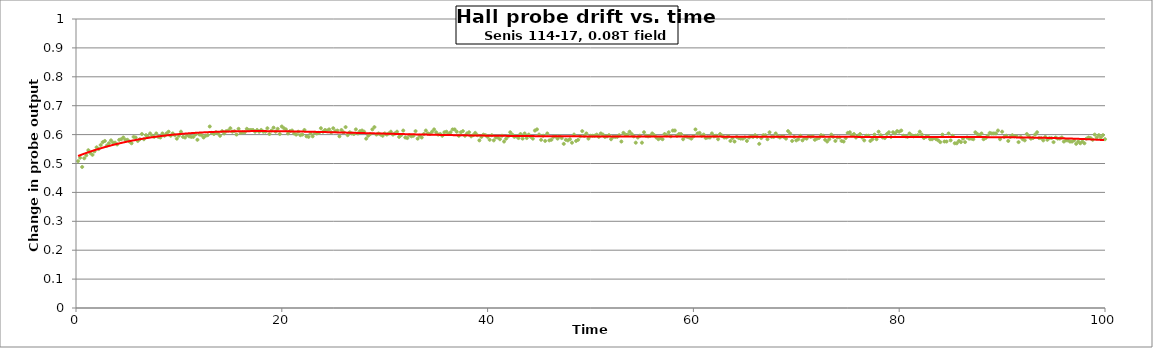
| Category | Probe |
|---|---|
| 0.2 | 0.508 |
| 0.4 | 0.52 |
| 0.6000000000000001 | 0.488 |
| 0.8 | 0.518 |
| 1.0 | 0.528 |
| 1.2 | 0.546 |
| 1.4 | 0.536 |
| 1.5999999999999999 | 0.53 |
| 1.7999999999999998 | 0.542 |
| 1.9999999999999998 | 0.556 |
| 2.1999999999999997 | 0.55 |
| 2.4 | 0.564 |
| 2.6 | 0.574 |
| 2.8000000000000003 | 0.578 |
| 3.0000000000000004 | 0.562 |
| 3.2000000000000006 | 0.57 |
| 3.400000000000001 | 0.58 |
| 3.600000000000001 | 0.572 |
| 3.800000000000001 | 0.572 |
| 4.000000000000001 | 0.566 |
| 4.200000000000001 | 0.582 |
| 4.400000000000001 | 0.584 |
| 4.600000000000001 | 0.59 |
| 4.800000000000002 | 0.582 |
| 5.000000000000002 | 0.582 |
| 5.200000000000002 | 0.576 |
| 5.400000000000002 | 0.57 |
| 5.600000000000002 | 0.592 |
| 5.8000000000000025 | 0.59 |
| 6.000000000000003 | 0.578 |
| 6.200000000000003 | 0.584 |
| 6.400000000000003 | 0.602 |
| 6.600000000000003 | 0.584 |
| 6.800000000000003 | 0.598 |
| 7.0000000000000036 | 0.592 |
| 7.200000000000004 | 0.604 |
| 7.400000000000004 | 0.596 |
| 7.600000000000004 | 0.592 |
| 7.800000000000004 | 0.604 |
| 8.000000000000004 | 0.592 |
| 8.200000000000003 | 0.59 |
| 8.400000000000002 | 0.604 |
| 8.600000000000001 | 0.596 |
| 8.8 | 0.604 |
| 9.0 | 0.61 |
| 9.2 | 0.596 |
| 9.399999999999999 | 0.604 |
| 9.599999999999998 | 0.598 |
| 9.799999999999997 | 0.586 |
| 9.999999999999996 | 0.596 |
| 10.199999999999996 | 0.61 |
| 10.399999999999995 | 0.592 |
| 10.599999999999994 | 0.59 |
| 10.799999999999994 | 0.598 |
| 10.999999999999993 | 0.594 |
| 11.199999999999992 | 0.592 |
| 11.399999999999991 | 0.592 |
| 11.59999999999999 | 0.6 |
| 11.79999999999999 | 0.582 |
| 11.99999999999999 | 0.6 |
| 12.199999999999989 | 0.598 |
| 12.399999999999988 | 0.59 |
| 12.599999999999987 | 0.596 |
| 12.799999999999986 | 0.598 |
| 12.999999999999986 | 0.628 |
| 13.199999999999985 | 0.606 |
| 13.399999999999984 | 0.602 |
| 13.599999999999984 | 0.608 |
| 13.799999999999983 | 0.604 |
| 13.999999999999982 | 0.596 |
| 14.199999999999982 | 0.612 |
| 14.39999999999998 | 0.604 |
| 14.59999999999998 | 0.612 |
| 14.79999999999998 | 0.614 |
| 14.999999999999979 | 0.622 |
| 15.199999999999978 | 0.61 |
| 15.399999999999977 | 0.612 |
| 15.599999999999977 | 0.6 |
| 15.799999999999976 | 0.62 |
| 15.999999999999975 | 0.606 |
| 16.199999999999974 | 0.608 |
| 16.399999999999974 | 0.608 |
| 16.599999999999973 | 0.62 |
| 16.799999999999972 | 0.616 |
| 16.99999999999997 | 0.616 |
| 17.19999999999997 | 0.616 |
| 17.39999999999997 | 0.61 |
| 17.59999999999997 | 0.616 |
| 17.79999999999997 | 0.61 |
| 17.999999999999968 | 0.616 |
| 18.199999999999967 | 0.61 |
| 18.399999999999967 | 0.61 |
| 18.599999999999966 | 0.622 |
| 18.799999999999965 | 0.602 |
| 18.999999999999964 | 0.614 |
| 19.199999999999964 | 0.624 |
| 19.399999999999963 | 0.61 |
| 19.599999999999962 | 0.62 |
| 19.79999999999996 | 0.602 |
| 19.99999999999996 | 0.628 |
| 20.19999999999996 | 0.622 |
| 20.39999999999996 | 0.618 |
| 20.59999999999996 | 0.604 |
| 20.799999999999958 | 0.612 |
| 20.999999999999957 | 0.614 |
| 21.199999999999957 | 0.604 |
| 21.399999999999956 | 0.6 |
| 21.599999999999955 | 0.61 |
| 21.799999999999955 | 0.598 |
| 21.999999999999954 | 0.6 |
| 22.199999999999953 | 0.616 |
| 22.399999999999952 | 0.594 |
| 22.59999999999995 | 0.592 |
| 22.79999999999995 | 0.604 |
| 22.99999999999995 | 0.594 |
| 23.19999999999995 | 0.606 |
| 23.39999999999995 | 0.604 |
| 23.599999999999948 | 0.606 |
| 23.799999999999947 | 0.622 |
| 23.999999999999947 | 0.61 |
| 24.199999999999946 | 0.616 |
| 24.399999999999945 | 0.614 |
| 24.599999999999945 | 0.618 |
| 24.799999999999944 | 0.608 |
| 24.999999999999943 | 0.622 |
| 25.199999999999942 | 0.612 |
| 25.39999999999994 | 0.614 |
| 25.59999999999994 | 0.594 |
| 25.79999999999994 | 0.616 |
| 25.99999999999994 | 0.608 |
| 26.19999999999994 | 0.626 |
| 26.399999999999938 | 0.598 |
| 26.599999999999937 | 0.608 |
| 26.799999999999937 | 0.604 |
| 26.999999999999936 | 0.602 |
| 27.199999999999935 | 0.618 |
| 27.399999999999935 | 0.604 |
| 27.599999999999934 | 0.612 |
| 27.799999999999933 | 0.614 |
| 27.999999999999932 | 0.61 |
| 28.199999999999932 | 0.586 |
| 28.39999999999993 | 0.596 |
| 28.59999999999993 | 0.602 |
| 28.79999999999993 | 0.618 |
| 28.99999999999993 | 0.626 |
| 29.19999999999993 | 0.6 |
| 29.399999999999928 | 0.604 |
| 29.599999999999927 | 0.6 |
| 29.799999999999926 | 0.596 |
| 29.999999999999925 | 0.604 |
| 30.199999999999925 | 0.6 |
| 30.399999999999924 | 0.604 |
| 30.599999999999923 | 0.61 |
| 30.799999999999923 | 0.6 |
| 30.999999999999922 | 0.604 |
| 31.19999999999992 | 0.61 |
| 31.39999999999992 | 0.592 |
| 31.59999999999992 | 0.598 |
| 31.79999999999992 | 0.614 |
| 31.99999999999992 | 0.59 |
| 32.19999999999992 | 0.588 |
| 32.39999999999992 | 0.598 |
| 32.59999999999992 | 0.594 |
| 32.799999999999926 | 0.596 |
| 32.99999999999993 | 0.612 |
| 33.19999999999993 | 0.586 |
| 33.399999999999935 | 0.596 |
| 33.59999999999994 | 0.59 |
| 33.79999999999994 | 0.602 |
| 33.99999999999994 | 0.614 |
| 34.199999999999946 | 0.604 |
| 34.39999999999995 | 0.602 |
| 34.59999999999995 | 0.61 |
| 34.799999999999955 | 0.618 |
| 34.99999999999996 | 0.608 |
| 35.19999999999996 | 0.6 |
| 35.39999999999996 | 0.602 |
| 35.599999999999966 | 0.596 |
| 35.79999999999997 | 0.608 |
| 35.99999999999997 | 0.61 |
| 36.199999999999974 | 0.602 |
| 36.39999999999998 | 0.608 |
| 36.59999999999998 | 0.618 |
| 36.79999999999998 | 0.618 |
| 36.999999999999986 | 0.61 |
| 37.19999999999999 | 0.596 |
| 37.39999999999999 | 0.608 |
| 37.599999999999994 | 0.612 |
| 37.8 | 0.596 |
| 38.0 | 0.604 |
| 38.2 | 0.608 |
| 38.400000000000006 | 0.594 |
| 38.60000000000001 | 0.598 |
| 38.80000000000001 | 0.606 |
| 39.000000000000014 | 0.598 |
| 39.20000000000002 | 0.58 |
| 39.40000000000002 | 0.592 |
| 39.60000000000002 | 0.6 |
| 39.800000000000026 | 0.598 |
| 40.00000000000003 | 0.592 |
| 40.20000000000003 | 0.582 |
| 40.400000000000034 | 0.598 |
| 40.60000000000004 | 0.58 |
| 40.80000000000004 | 0.59 |
| 41.00000000000004 | 0.59 |
| 41.200000000000045 | 0.584 |
| 41.40000000000005 | 0.596 |
| 41.60000000000005 | 0.576 |
| 41.800000000000054 | 0.586 |
| 42.00000000000006 | 0.594 |
| 42.20000000000006 | 0.608 |
| 42.40000000000006 | 0.6 |
| 42.600000000000065 | 0.592 |
| 42.80000000000007 | 0.594 |
| 43.00000000000007 | 0.588 |
| 43.200000000000074 | 0.602 |
| 43.40000000000008 | 0.586 |
| 43.60000000000008 | 0.604 |
| 43.80000000000008 | 0.588 |
| 44.000000000000085 | 0.6 |
| 44.20000000000009 | 0.592 |
| 44.40000000000009 | 0.586 |
| 44.600000000000094 | 0.614 |
| 44.8000000000001 | 0.618 |
| 45.0000000000001 | 0.6 |
| 45.2000000000001 | 0.582 |
| 45.400000000000105 | 0.596 |
| 45.60000000000011 | 0.578 |
| 45.80000000000011 | 0.604 |
| 46.000000000000114 | 0.58 |
| 46.20000000000012 | 0.582 |
| 46.40000000000012 | 0.592 |
| 46.60000000000012 | 0.594 |
| 46.800000000000125 | 0.586 |
| 47.00000000000013 | 0.594 |
| 47.20000000000013 | 0.588 |
| 47.400000000000134 | 0.568 |
| 47.600000000000136 | 0.582 |
| 47.80000000000014 | 0.58 |
| 48.00000000000014 | 0.584 |
| 48.200000000000145 | 0.572 |
| 48.40000000000015 | 0.6 |
| 48.60000000000015 | 0.578 |
| 48.80000000000015 | 0.582 |
| 49.000000000000156 | 0.594 |
| 49.20000000000016 | 0.612 |
| 49.40000000000016 | 0.596 |
| 49.600000000000165 | 0.604 |
| 49.80000000000017 | 0.586 |
| 50.00000000000017 | 0.596 |
| 50.20000000000017 | 0.596 |
| 50.400000000000176 | 0.596 |
| 50.60000000000018 | 0.6 |
| 50.80000000000018 | 0.592 |
| 51.000000000000185 | 0.604 |
| 51.20000000000019 | 0.6 |
| 51.40000000000019 | 0.592 |
| 51.60000000000019 | 0.594 |
| 51.800000000000196 | 0.598 |
| 52.0000000000002 | 0.584 |
| 52.2000000000002 | 0.592 |
| 52.400000000000205 | 0.592 |
| 52.60000000000021 | 0.592 |
| 52.80000000000021 | 0.598 |
| 53.00000000000021 | 0.576 |
| 53.200000000000216 | 0.606 |
| 53.40000000000022 | 0.6 |
| 53.60000000000022 | 0.6 |
| 53.800000000000225 | 0.61 |
| 54.00000000000023 | 0.602 |
| 54.20000000000023 | 0.594 |
| 54.40000000000023 | 0.572 |
| 54.600000000000236 | 0.59 |
| 54.80000000000024 | 0.596 |
| 55.00000000000024 | 0.572 |
| 55.200000000000244 | 0.608 |
| 55.40000000000025 | 0.596 |
| 55.60000000000025 | 0.594 |
| 55.80000000000025 | 0.596 |
| 56.000000000000256 | 0.604 |
| 56.20000000000026 | 0.598 |
| 56.40000000000026 | 0.59 |
| 56.600000000000264 | 0.584 |
| 56.80000000000027 | 0.588 |
| 57.00000000000027 | 0.584 |
| 57.20000000000027 | 0.602 |
| 57.400000000000276 | 0.598 |
| 57.60000000000028 | 0.608 |
| 57.80000000000028 | 0.594 |
| 58.000000000000284 | 0.614 |
| 58.20000000000029 | 0.614 |
| 58.40000000000029 | 0.596 |
| 58.60000000000029 | 0.602 |
| 58.800000000000296 | 0.602 |
| 59.0000000000003 | 0.584 |
| 59.2000000000003 | 0.594 |
| 59.400000000000304 | 0.592 |
| 59.60000000000031 | 0.59 |
| 59.80000000000031 | 0.586 |
| 60.00000000000031 | 0.594 |
| 60.200000000000315 | 0.618 |
| 60.40000000000032 | 0.604 |
| 60.60000000000032 | 0.606 |
| 60.800000000000324 | 0.596 |
| 61.00000000000033 | 0.6 |
| 61.20000000000033 | 0.588 |
| 61.40000000000033 | 0.59 |
| 61.600000000000335 | 0.59 |
| 61.80000000000034 | 0.604 |
| 62.00000000000034 | 0.594 |
| 62.200000000000344 | 0.596 |
| 62.40000000000035 | 0.584 |
| 62.60000000000035 | 0.602 |
| 62.80000000000035 | 0.596 |
| 63.000000000000355 | 0.59 |
| 63.20000000000036 | 0.59 |
| 63.40000000000036 | 0.594 |
| 63.600000000000364 | 0.578 |
| 63.80000000000037 | 0.588 |
| 64.00000000000037 | 0.576 |
| 64.20000000000037 | 0.592 |
| 64.40000000000038 | 0.588 |
| 64.60000000000038 | 0.586 |
| 64.80000000000038 | 0.586 |
| 65.00000000000038 | 0.59 |
| 65.20000000000039 | 0.578 |
| 65.40000000000039 | 0.59 |
| 65.60000000000039 | 0.594 |
| 65.8000000000004 | 0.592 |
| 66.0000000000004 | 0.598 |
| 66.2000000000004 | 0.592 |
| 66.4000000000004 | 0.568 |
| 66.6000000000004 | 0.588 |
| 66.80000000000041 | 0.598 |
| 67.00000000000041 | 0.598 |
| 67.20000000000041 | 0.584 |
| 67.40000000000042 | 0.608 |
| 67.60000000000042 | 0.592 |
| 67.80000000000042 | 0.592 |
| 68.00000000000043 | 0.604 |
| 68.20000000000043 | 0.594 |
| 68.40000000000043 | 0.59 |
| 68.60000000000043 | 0.594 |
| 68.80000000000044 | 0.592 |
| 69.00000000000044 | 0.586 |
| 69.20000000000044 | 0.612 |
| 69.40000000000045 | 0.604 |
| 69.60000000000045 | 0.578 |
| 69.80000000000045 | 0.592 |
| 70.00000000000045 | 0.58 |
| 70.20000000000046 | 0.584 |
| 70.40000000000046 | 0.596 |
| 70.60000000000046 | 0.58 |
| 70.80000000000047 | 0.588 |
| 71.00000000000047 | 0.586 |
| 71.20000000000047 | 0.594 |
| 71.40000000000047 | 0.592 |
| 71.60000000000048 | 0.594 |
| 71.80000000000048 | 0.582 |
| 72.00000000000048 | 0.586 |
| 72.20000000000049 | 0.588 |
| 72.40000000000049 | 0.598 |
| 72.60000000000049 | 0.596 |
| 72.8000000000005 | 0.582 |
| 73.0000000000005 | 0.576 |
| 73.2000000000005 | 0.584 |
| 73.4000000000005 | 0.6 |
| 73.6000000000005 | 0.592 |
| 73.80000000000051 | 0.578 |
| 74.00000000000051 | 0.59 |
| 74.20000000000051 | 0.59 |
| 74.40000000000052 | 0.578 |
| 74.60000000000052 | 0.576 |
| 74.80000000000052 | 0.588 |
| 75.00000000000053 | 0.606 |
| 75.20000000000053 | 0.608 |
| 75.40000000000053 | 0.598 |
| 75.60000000000053 | 0.602 |
| 75.80000000000054 | 0.59 |
| 76.00000000000054 | 0.596 |
| 76.20000000000054 | 0.602 |
| 76.40000000000055 | 0.59 |
| 76.60000000000055 | 0.58 |
| 76.80000000000055 | 0.596 |
| 77.00000000000055 | 0.596 |
| 77.20000000000056 | 0.578 |
| 77.40000000000056 | 0.584 |
| 77.60000000000056 | 0.6 |
| 77.80000000000057 | 0.584 |
| 78.00000000000057 | 0.61 |
| 78.20000000000057 | 0.598 |
| 78.40000000000057 | 0.59 |
| 78.60000000000058 | 0.588 |
| 78.80000000000058 | 0.602 |
| 79.00000000000058 | 0.608 |
| 79.20000000000059 | 0.592 |
| 79.40000000000059 | 0.608 |
| 79.60000000000059 | 0.604 |
| 79.8000000000006 | 0.612 |
| 80.0000000000006 | 0.61 |
| 80.2000000000006 | 0.614 |
| 80.4000000000006 | 0.596 |
| 80.6000000000006 | 0.594 |
| 80.80000000000061 | 0.592 |
| 81.00000000000061 | 0.604 |
| 81.20000000000061 | 0.598 |
| 81.40000000000062 | 0.594 |
| 81.60000000000062 | 0.596 |
| 81.80000000000062 | 0.598 |
| 82.00000000000063 | 0.61 |
| 82.20000000000063 | 0.6 |
| 82.40000000000063 | 0.588 |
| 82.60000000000063 | 0.592 |
| 82.80000000000064 | 0.594 |
| 83.00000000000064 | 0.584 |
| 83.20000000000064 | 0.584 |
| 83.40000000000065 | 0.588 |
| 83.60000000000065 | 0.584 |
| 83.80000000000065 | 0.58 |
| 84.00000000000065 | 0.574 |
| 84.20000000000066 | 0.6 |
| 84.40000000000066 | 0.576 |
| 84.60000000000066 | 0.576 |
| 84.80000000000067 | 0.604 |
| 85.00000000000067 | 0.58 |
| 85.20000000000067 | 0.596 |
| 85.40000000000067 | 0.57 |
| 85.60000000000068 | 0.57 |
| 85.80000000000068 | 0.578 |
| 86.00000000000068 | 0.574 |
| 86.20000000000068 | 0.586 |
| 86.40000000000069 | 0.574 |
| 86.60000000000069 | 0.59 |
| 86.8000000000007 | 0.586 |
| 87.0000000000007 | 0.586 |
| 87.2000000000007 | 0.584 |
| 87.4000000000007 | 0.608 |
| 87.6000000000007 | 0.602 |
| 87.80000000000071 | 0.598 |
| 88.00000000000071 | 0.604 |
| 88.20000000000071 | 0.584 |
| 88.40000000000072 | 0.588 |
| 88.60000000000072 | 0.596 |
| 88.80000000000072 | 0.606 |
| 89.00000000000072 | 0.604 |
| 89.20000000000073 | 0.604 |
| 89.40000000000073 | 0.604 |
| 89.60000000000073 | 0.614 |
| 89.80000000000074 | 0.584 |
| 90.00000000000074 | 0.61 |
| 90.20000000000074 | 0.592 |
| 90.40000000000074 | 0.596 |
| 90.60000000000075 | 0.578 |
| 90.80000000000075 | 0.592 |
| 91.00000000000075 | 0.598 |
| 91.20000000000076 | 0.594 |
| 91.40000000000076 | 0.594 |
| 91.60000000000076 | 0.574 |
| 91.80000000000076 | 0.592 |
| 92.00000000000077 | 0.584 |
| 92.20000000000077 | 0.58 |
| 92.40000000000077 | 0.602 |
| 92.60000000000078 | 0.594 |
| 92.80000000000078 | 0.586 |
| 93.00000000000078 | 0.588 |
| 93.20000000000078 | 0.6 |
| 93.40000000000079 | 0.608 |
| 93.60000000000079 | 0.588 |
| 93.8000000000008 | 0.588 |
| 94.0000000000008 | 0.58 |
| 94.2000000000008 | 0.592 |
| 94.4000000000008 | 0.582 |
| 94.6000000000008 | 0.588 |
| 94.80000000000081 | 0.588 |
| 95.00000000000081 | 0.574 |
| 95.20000000000081 | 0.59 |
| 95.40000000000082 | 0.586 |
| 95.60000000000082 | 0.586 |
| 95.80000000000082 | 0.59 |
| 96.00000000000082 | 0.576 |
| 96.20000000000083 | 0.58 |
| 96.40000000000083 | 0.58 |
| 96.60000000000083 | 0.576 |
| 96.80000000000084 | 0.576 |
| 97.00000000000084 | 0.58 |
| 97.20000000000084 | 0.568 |
| 97.40000000000084 | 0.576 |
| 97.60000000000085 | 0.57 |
| 97.80000000000085 | 0.576 |
| 98.00000000000085 | 0.57 |
| 98.20000000000086 | 0.586 |
| 98.40000000000086 | 0.59 |
| 98.60000000000086 | 0.588 |
| 98.80000000000086 | 0.582 |
| 99.00000000000087 | 0.6 |
| 99.20000000000087 | 0.59 |
| 99.40000000000087 | 0.598 |
| 99.60000000000088 | 0.59 |
| 99.80000000000088 | 0.598 |
| 100.00000000000088 | 0.584 |
| nan | 0.596 |
| nan | 0.584 |
| nan | 0.59 |
| nan | 0.614 |
| nan | 0.596 |
| nan | 0.598 |
| nan | 0.584 |
| nan | 0.592 |
| nan | 0.594 |
| nan | 0.602 |
| nan | 0.6 |
| nan | 0.586 |
| nan | 0.588 |
| nan | 0.59 |
| nan | 0.586 |
| nan | 0.582 |
| nan | 0.58 |
| nan | 0.596 |
| nan | 0.598 |
| nan | 0.606 |
| nan | 0.586 |
| nan | 0.594 |
| nan | 0.612 |
| nan | 0.598 |
| nan | 0.602 |
| nan | 0.61 |
| nan | 0.572 |
| nan | 0.596 |
| nan | 0.6 |
| nan | 0.612 |
| nan | 0.596 |
| nan | 0.586 |
| nan | 0.59 |
| nan | 0.602 |
| nan | 0.592 |
| nan | 0.58 |
| nan | 0.586 |
| nan | 0.58 |
| nan | 0.578 |
| nan | 0.584 |
| nan | 0.584 |
| nan | 0.594 |
| nan | 0.584 |
| nan | 0.604 |
| nan | 0.578 |
| nan | 0.586 |
| nan | 0.572 |
| nan | 0.582 |
| nan | 0.584 |
| nan | 0.588 |
| nan | 0.576 |
| nan | 0.574 |
| nan | 0.588 |
| nan | 0.59 |
| nan | 0.604 |
| nan | 0.604 |
| nan | 0.606 |
| nan | 0.604 |
| nan | 0.59 |
| nan | 0.598 |
| nan | 0.598 |
| nan | 0.59 |
| nan | 0.594 |
| nan | 0.588 |
| nan | 0.582 |
| nan | 0.588 |
| nan | 0.574 |
| nan | 0.598 |
| nan | 0.604 |
| nan | 0.596 |
| nan | 0.604 |
| nan | 0.58 |
| nan | 0.6 |
| nan | 0.594 |
| nan | 0.59 |
| nan | 0.592 |
| nan | 0.594 |
| nan | 0.59 |
| nan | 0.604 |
| nan | 0.596 |
| nan | 0.6 |
| nan | 0.584 |
| nan | 0.592 |
| nan | 0.59 |
| nan | 0.598 |
| nan | 0.59 |
| nan | 0.592 |
| nan | 0.584 |
| nan | 0.588 |
| nan | 0.602 |
| nan | 0.58 |
| nan | 0.584 |
| nan | 0.584 |
| nan | 0.588 |
| nan | 0.584 |
| nan | 0.592 |
| nan | 0.592 |
| nan | 0.566 |
| nan | 0.576 |
| nan | 0.582 |
| nan | 0.582 |
| nan | 0.578 |
| nan | 0.578 |
| nan | 0.582 |
| nan | 0.592 |
| nan | 0.578 |
| nan | 0.582 |
| nan | 0.59 |
| nan | 0.582 |
| nan | 0.59 |
| nan | 0.58 |
| nan | 0.578 |
| nan | 0.574 |
| nan | 0.57 |
| nan | 0.56 |
| nan | 0.564 |
| nan | 0.568 |
| nan | 0.57 |
| nan | 0.566 |
| nan | 0.566 |
| nan | 0.576 |
| nan | 0.572 |
| nan | 0.556 |
| nan | 0.568 |
| nan | 0.562 |
| nan | 0.576 |
| nan | 0.582 |
| nan | 0.568 |
| nan | 0.578 |
| nan | 0.568 |
| nan | 0.59 |
| nan | 0.576 |
| nan | 0.568 |
| nan | 0.58 |
| nan | 0.59 |
| nan | 0.594 |
| nan | 0.57 |
| nan | 0.58 |
| nan | 0.58 |
| nan | 0.57 |
| nan | 0.584 |
| nan | 0.594 |
| nan | 0.578 |
| nan | 0.592 |
| nan | 0.58 |
| nan | 0.594 |
| nan | 0.596 |
| nan | 0.596 |
| nan | 0.604 |
| nan | 0.598 |
| nan | 0.59 |
| nan | 0.586 |
| nan | 0.59 |
| nan | 0.598 |
| nan | 0.588 |
| nan | 0.592 |
| nan | 0.602 |
| nan | 0.588 |
| nan | 0.596 |
| nan | 0.574 |
| nan | 0.59 |
| nan | 0.592 |
| nan | 0.59 |
| nan | 0.584 |
| nan | 0.578 |
| nan | 0.612 |
| nan | 0.588 |
| nan | 0.602 |
| nan | 0.604 |
| nan | 0.584 |
| nan | 0.594 |
| nan | 0.594 |
| nan | 0.594 |
| nan | 0.584 |
| nan | 0.578 |
| nan | 0.588 |
| nan | 0.586 |
| nan | 0.586 |
| nan | 0.578 |
| nan | 0.584 |
| nan | 0.582 |
| nan | 0.584 |
| nan | 0.58 |
| nan | 0.594 |
| nan | 0.598 |
| nan | 0.588 |
| nan | 0.59 |
| nan | 0.602 |
| nan | 0.594 |
| nan | 0.612 |
| nan | 0.608 |
| nan | 0.598 |
| nan | 0.59 |
| nan | 0.588 |
| nan | 0.594 |
| nan | 0.59 |
| nan | 0.576 |
| nan | 0.592 |
| nan | 0.602 |
| nan | 0.616 |
| nan | 0.602 |
| nan | 0.594 |
| nan | 0.582 |
| nan | 0.596 |
| nan | 0.604 |
| nan | 0.61 |
| nan | 0.604 |
| nan | 0.61 |
| nan | 0.614 |
| nan | 0.594 |
| nan | 0.604 |
| nan | 0.584 |
| nan | 0.6 |
| nan | 0.608 |
| nan | 0.602 |
| nan | 0.61 |
| nan | 0.59 |
| nan | 0.59 |
| nan | 0.594 |
| nan | 0.602 |
| nan | 0.586 |
| nan | 0.582 |
| nan | 0.592 |
| nan | 0.596 |
| nan | 0.584 |
| nan | 0.582 |
| nan | 0.594 |
| nan | 0.582 |
| nan | 0.596 |
| nan | 0.594 |
| nan | 0.586 |
| nan | 0.574 |
| nan | 0.588 |
| nan | 0.586 |
| nan | 0.588 |
| nan | 0.576 |
| nan | 0.594 |
| nan | 0.58 |
| nan | 0.604 |
| nan | 0.592 |
| nan | 0.59 |
| nan | 0.588 |
| nan | 0.596 |
| nan | 0.586 |
| nan | 0.58 |
| nan | 0.578 |
| nan | 0.578 |
| nan | 0.576 |
| nan | 0.586 |
| nan | 0.58 |
| nan | 0.58 |
| nan | 0.572 |
| nan | 0.594 |
| nan | 0.584 |
| nan | 0.588 |
| nan | 0.576 |
| nan | 0.592 |
| nan | 0.578 |
| nan | 0.582 |
| nan | 0.578 |
| nan | 0.57 |
| nan | 0.58 |
| nan | 0.596 |
| nan | 0.586 |
| nan | 0.596 |
| nan | 0.598 |
| nan | 0.594 |
| nan | 0.594 |
| nan | 0.602 |
| nan | 0.59 |
| nan | 0.598 |
| nan | 0.586 |
| nan | 0.6 |
| nan | 0.606 |
| nan | 0.58 |
| nan | 0.584 |
| nan | 0.578 |
| nan | 0.596 |
| nan | 0.582 |
| nan | 0.584 |
| nan | 0.59 |
| nan | 0.588 |
| nan | 0.596 |
| nan | 0.602 |
| nan | 0.606 |
| nan | 0.602 |
| nan | 0.588 |
| nan | 0.602 |
| nan | 0.596 |
| nan | 0.586 |
| nan | 0.598 |
| nan | 0.612 |
| nan | 0.592 |
| nan | 0.6 |
| nan | 0.588 |
| nan | 0.596 |
| nan | 0.576 |
| nan | 0.588 |
| nan | 0.572 |
| nan | 0.6 |
| nan | 0.6 |
| nan | 0.596 |
| nan | 0.592 |
| nan | 0.578 |
| nan | 0.59 |
| nan | 0.592 |
| nan | 0.598 |
| nan | 0.588 |
| nan | 0.58 |
| nan | 0.576 |
| nan | 0.598 |
| nan | 0.592 |
| nan | 0.594 |
| nan | 0.602 |
| nan | 0.598 |
| nan | 0.608 |
| nan | 0.592 |
| nan | 0.598 |
| nan | 0.592 |
| nan | 0.572 |
| nan | 0.596 |
| nan | 0.59 |
| nan | 0.576 |
| nan | 0.576 |
| nan | 0.58 |
| nan | 0.568 |
| nan | 0.576 |
| nan | 0.588 |
| nan | 0.582 |
| nan | 0.582 |
| nan | 0.572 |
| nan | 0.576 |
| nan | 0.564 |
| nan | 0.578 |
| nan | 0.564 |
| nan | 0.566 |
| nan | 0.558 |
| nan | 0.568 |
| nan | 0.572 |
| nan | 0.59 |
| nan | 0.584 |
| nan | 0.564 |
| nan | 0.57 |
| nan | 0.588 |
| nan | 0.58 |
| nan | 0.562 |
| nan | 0.588 |
| nan | 0.564 |
| nan | 0.576 |
| nan | 0.584 |
| nan | 0.564 |
| nan | 0.578 |
| nan | 0.562 |
| nan | 0.572 |
| nan | 0.562 |
| nan | 0.584 |
| nan | 0.576 |
| nan | 0.574 |
| nan | 0.57 |
| nan | 0.572 |
| nan | 0.566 |
| nan | 0.584 |
| nan | 0.582 |
| nan | 0.562 |
| nan | 0.574 |
| nan | 0.58 |
| nan | 0.58 |
| nan | 0.584 |
| nan | 0.58 |
| nan | 0.58 |
| nan | 0.562 |
| nan | 0.572 |
| nan | 0.588 |
| nan | 0.58 |
| nan | 0.586 |
| nan | 0.584 |
| nan | 0.572 |
| nan | 0.58 |
| nan | 0.584 |
| nan | 0.572 |
| nan | 0.57 |
| nan | 0.58 |
| nan | 0.578 |
| nan | 0.566 |
| nan | 0.57 |
| nan | 0.578 |
| nan | 0.586 |
| nan | 0.574 |
| nan | 0.574 |
| nan | 0.584 |
| nan | 0.578 |
| nan | 0.58 |
| nan | 0.57 |
| nan | 0.582 |
| nan | 0.582 |
| nan | 0.566 |
| nan | 0.588 |
| nan | 0.566 |
| nan | 0.58 |
| nan | 0.58 |
| nan | 0.566 |
| nan | 0.568 |
| nan | 0.572 |
| nan | 0.564 |
| nan | 0.584 |
| nan | 0.554 |
| nan | 0.576 |
| nan | 0.564 |
| nan | 0.574 |
| nan | 0.57 |
| nan | 0.584 |
| nan | 0.568 |
| nan | 0.574 |
| nan | 0.594 |
| nan | 0.6 |
| nan | 0.578 |
| nan | 0.588 |
| nan | 0.574 |
| nan | 0.582 |
| nan | 0.572 |
| nan | 0.584 |
| nan | 0.584 |
| nan | 0.59 |
| nan | 0.586 |
| nan | 0.576 |
| nan | 0.582 |
| nan | 0.582 |
| nan | 0.572 |
| nan | 0.57 |
| nan | 0.568 |
| nan | 0.556 |
| nan | 0.572 |
| nan | 0.58 |
| nan | 0.558 |
| nan | 0.578 |
| nan | 0.566 |
| nan | 0.576 |
| nan | 0.574 |
| nan | 0.574 |
| nan | 0.566 |
| nan | 0.576 |
| nan | 0.598 |
| nan | 0.59 |
| nan | 0.588 |
| nan | 0.59 |
| nan | 0.584 |
| nan | 0.576 |
| nan | 0.58 |
| nan | 0.582 |
| nan | 0.574 |
| nan | 0.586 |
| nan | 0.558 |
| nan | 0.574 |
| nan | 0.576 |
| nan | 0.578 |
| nan | 0.59 |
| nan | 0.582 |
| nan | 0.564 |
| nan | 0.576 |
| nan | 0.586 |
| nan | 0.574 |
| nan | 0.584 |
| nan | 0.592 |
| nan | 0.58 |
| nan | 0.592 |
| nan | 0.584 |
| nan | 0.584 |
| nan | 0.576 |
| nan | 0.572 |
| nan | 0.566 |
| nan | 0.578 |
| nan | 0.586 |
| nan | 0.586 |
| nan | 0.58 |
| nan | 0.576 |
| nan | 0.582 |
| nan | 0.564 |
| nan | 0.586 |
| nan | 0.588 |
| nan | 0.566 |
| nan | 0.58 |
| nan | 0.576 |
| nan | 0.56 |
| nan | 0.572 |
| nan | 0.57 |
| nan | 0.57 |
| nan | 0.566 |
| nan | 0.578 |
| nan | 0.578 |
| nan | 0.568 |
| nan | 0.57 |
| nan | 0.574 |
| nan | 0.554 |
| nan | 0.57 |
| nan | 0.576 |
| nan | 0.58 |
| nan | 0.58 |
| nan | 0.588 |
| nan | 0.584 |
| nan | 0.574 |